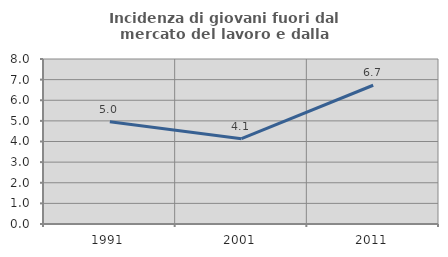
| Category | Incidenza di giovani fuori dal mercato del lavoro e dalla formazione  |
|---|---|
| 1991.0 | 4.952 |
| 2001.0 | 4.136 |
| 2011.0 | 6.728 |